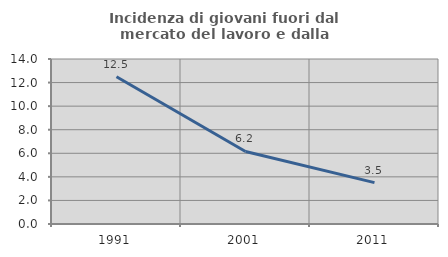
| Category | Incidenza di giovani fuori dal mercato del lavoro e dalla formazione  |
|---|---|
| 1991.0 | 12.5 |
| 2001.0 | 6.154 |
| 2011.0 | 3.509 |